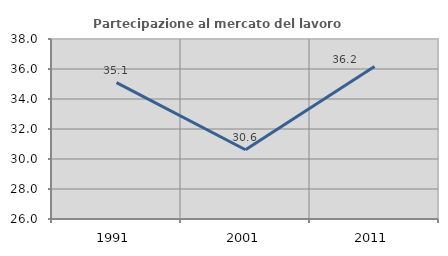
| Category | Partecipazione al mercato del lavoro  femminile |
|---|---|
| 1991.0 | 35.092 |
| 2001.0 | 30.619 |
| 2011.0 | 36.161 |